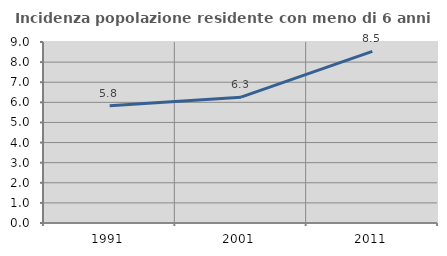
| Category | Incidenza popolazione residente con meno di 6 anni |
|---|---|
| 1991.0 | 5.835 |
| 2001.0 | 6.259 |
| 2011.0 | 8.53 |